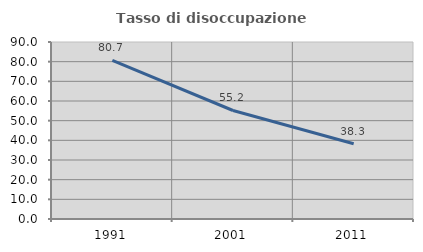
| Category | Tasso di disoccupazione giovanile  |
|---|---|
| 1991.0 | 80.695 |
| 2001.0 | 55.172 |
| 2011.0 | 38.298 |